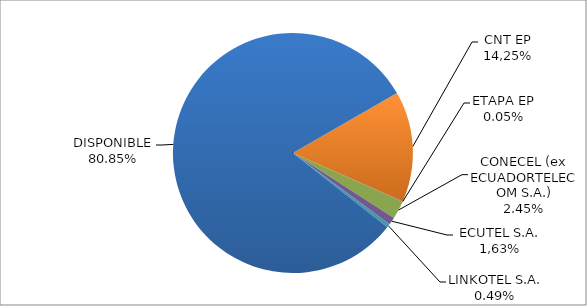
| Category | CODIGO DE AREA 4 |
|---|---|
| CORPORACIÓN NACIONAL TELECOMUNICACIONES CNT EP | 0.149 |
| ETAPA EP | 0.001 |
| CONECEL (ex ECUADORTELECOM S.A.) | 0.024 |
| SETEL S.A. | 0.01 |
| LINKOTEL S.A. | 0.005 |
| DISPONIBLE | 0.808 |